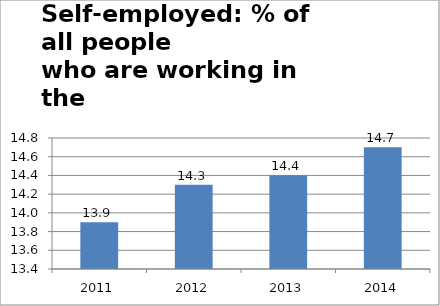
| Category | Self-employed |
|---|---|
| 2011.0 | 13.9 |
| 2012.0 | 14.3 |
| 2013.0 | 14.4 |
| 2014.0 | 14.7 |